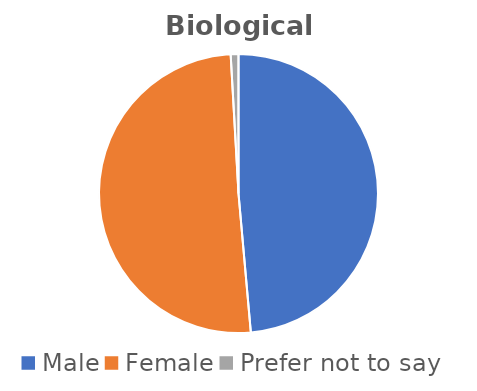
| Category | Series 0 |
|---|---|
| Male | 379 |
| Female | 394 |
| Prefer not to say | 7 |